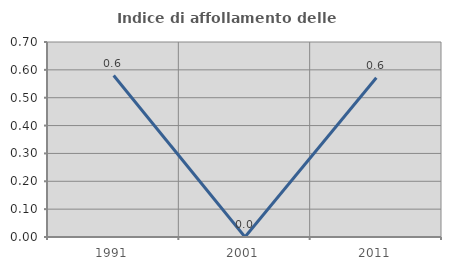
| Category | Indice di affollamento delle abitazioni  |
|---|---|
| 1991.0 | 0.58 |
| 2001.0 | 0 |
| 2011.0 | 0.571 |